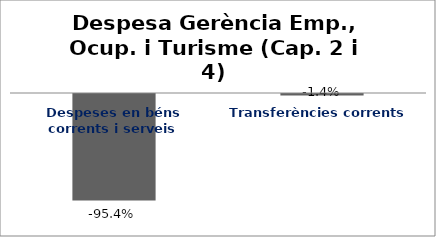
| Category | Series 0 |
|---|---|
| Despeses en béns corrents i serveis | -0.954 |
| Transferències corrents | -0.014 |